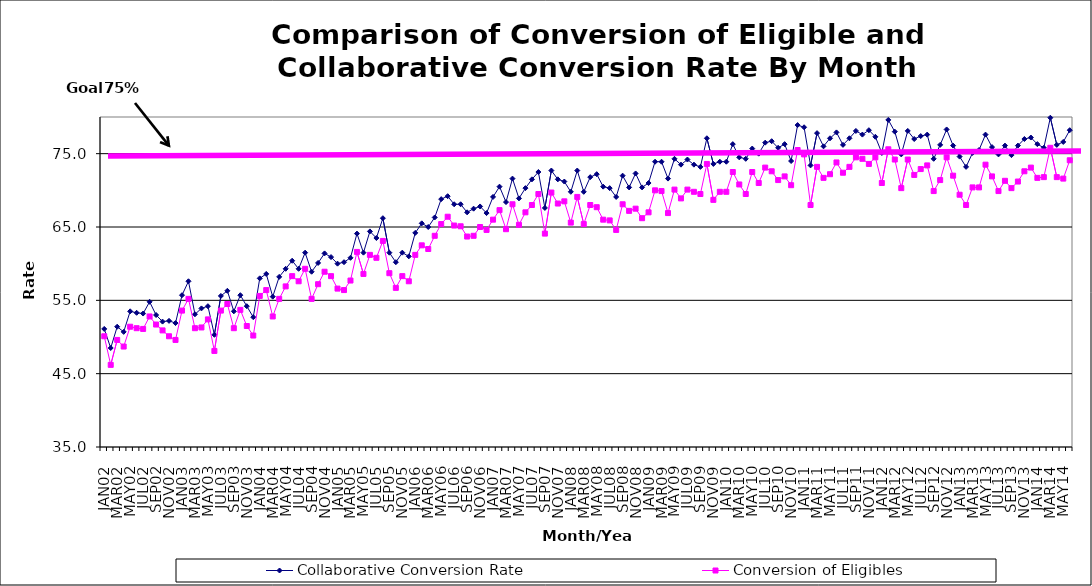
| Category | Collaborative Conversion Rate | Conversion of Eligibles |
|---|---|---|
| JAN02 | 51.1 | 50.1 |
| FEB02 | 48.5 | 46.2 |
| MAR02 | 51.4 | 49.6 |
| APR02 | 50.7 | 48.7 |
| MAY02 | 53.5 | 51.4 |
| JUN02 | 53.3 | 51.2 |
| JUL02 | 53.2 | 51.1 |
| AUG02 | 54.8 | 52.8 |
| SEP02 | 53 | 51.7 |
| OCT02 | 52.1 | 50.9 |
| NOV02 | 52.2 | 50.1 |
| DEC02 | 51.9 | 49.6 |
| JAN03 | 55.7 | 53.6 |
| FEB03 | 57.6 | 55.2 |
| MAR03 | 53.1 | 51.2 |
| APR03 | 53.9 | 51.3 |
| MAY03 | 54.2 | 52.4 |
| JUN03 | 50.3 | 48.1 |
| JUL03 | 55.6 | 53.6 |
| AUG03 | 56.3 | 54.5 |
| SEP03 | 53.5 | 51.2 |
| OCT03 | 55.7 | 53.7 |
| NOV03 | 54.2 | 51.5 |
| DEC03 | 52.7 | 50.2 |
| JAN04 | 58 | 55.6 |
| FEB04 | 58.6 | 56.4 |
| MAR04 | 55.5 | 52.8 |
| APR04 | 58.2 | 55.2 |
| MAY04 | 59.3 | 56.9 |
| JUN04 | 60.4 | 58.3 |
| JUL04 | 59.3 | 57.6 |
| AUG04 | 61.5 | 59.3 |
| SEP04 | 58.9 | 55.2 |
| OCT04 | 60.1 | 57.2 |
| NOV04 | 61.4 | 58.9 |
| DEC04 | 60.9 | 58.3 |
| JAN05 | 60 | 56.6 |
| FEB05 | 60.2 | 56.4 |
| MAR05 | 60.8 | 57.7 |
| APR05 | 64.1 | 61.6 |
| MAY05 | 61.5 | 58.6 |
| JUN05 | 64.4 | 61.2 |
| JUL05 | 63.5 | 60.8 |
| AUG05 | 66.2 | 63.1 |
| SEP05 | 61.5 | 58.7 |
| OCT05 | 60.2 | 56.7 |
| NOV05 | 61.5 | 58.3 |
| DEC05 | 61 | 57.6 |
| JAN06 | 64.2 | 61.2 |
| FEB06 | 65.5 | 62.5 |
| MAR06 | 65 | 62 |
| APR06 | 66.3 | 63.8 |
| MAY06 | 68.8 | 65.4 |
| JUN06 | 69.2 | 66.4 |
| JUL06 | 68.1 | 65.2 |
| AUG06 | 68.1 | 65.1 |
| SEP06 | 67 | 63.7 |
| OCT06 | 67.5 | 63.8 |
| NOV06 | 67.8 | 65 |
| DEC06 | 66.9 | 64.6 |
| JAN07 | 69.1 | 66 |
| FEB07 | 70.5 | 67.3 |
| MAR07 | 68.4 | 64.7 |
| APR07 | 71.6 | 68.1 |
| MAY07 | 68.9 | 65.3 |
| JUN07 | 70.3 | 67 |
| JUL07 | 71.5 | 68 |
| AUG07 | 72.5 | 69.5 |
| SEP07 | 67.6 | 64.1 |
| OCT07 | 72.7 | 69.7 |
| NOV07 | 71.5 | 68.2 |
| DEC07 | 71.2 | 68.5 |
| JAN08 | 69.8 | 65.6 |
| FEB08 | 72.7 | 69.1 |
| MAR08 | 69.8 | 65.4 |
| APR08 | 71.8 | 68 |
| MAY08 | 72.2 | 67.7 |
| JUN08 | 70.5 | 66 |
| JUL08 | 70.3 | 65.9 |
| AUG08 | 69.1 | 64.6 |
| SEP08 | 72 | 68.1 |
| OCT08 | 70.4 | 67.2 |
| NOV08 | 72.3 | 67.5 |
| DEC08 | 70.4 | 66.2 |
| JAN09 | 71 | 67 |
| FEB09 | 73.9 | 70 |
| MAR09 | 73.9 | 69.9 |
| APR09 | 71.6 | 66.9 |
| MAY09 | 74.3 | 70.1 |
| JUN09 | 73.5 | 68.9 |
| JUL09 | 74.2 | 70.1 |
| AUG09 | 73.5 | 69.8 |
| SEP09 | 73.2 | 69.5 |
| OCT09 | 77.1 | 73.6 |
| NOV09 | 73.6 | 68.7 |
| DEC09 | 73.9 | 69.8 |
| JAN10 | 73.9 | 69.8 |
| FEB10 | 76.3 | 72.5 |
| MAR10 | 74.5 | 70.8 |
| APR10 | 74.3 | 69.5 |
| MAY10 | 75.7 | 72.5 |
| JUN10 | 75 | 71 |
| JUL10 | 76.5 | 73.1 |
| AUG10 | 76.7 | 72.6 |
| SEP10 | 75.8 | 71.4 |
| OCT10 | 76.3 | 71.9 |
| NOV10 | 74 | 70.7 |
| DEC10 | 78.9 | 75.5 |
| JAN11 | 78.6 | 74.9 |
| FEB11 | 73.4 | 68 |
| MAR11 | 77.8 | 73.2 |
| APR11 | 76 | 71.7 |
| MAY11 | 77.1 | 72.2 |
| JUN11 | 77.9 | 73.8 |
| JUL11 | 76.2 | 72.4 |
| AUG11 | 77.1 | 73.2 |
| SEP11 | 78.1 | 74.5 |
| OCT11 | 77.6 | 74.3 |
| NOV11 | 78.2 | 73.6 |
| DEC11 | 77.3 | 74.5 |
| JAN12 | 75.1 | 71 |
| FEB12 | 79.6 | 75.6 |
| MAR12 | 78 | 74.2 |
| APR12 | 74.9 | 70.3 |
| MAY12 | 78.1 | 74.2 |
| JUN12 | 77 | 72.1 |
| JUL12 | 77.4 | 72.9 |
| AUG12 | 77.6 | 73.4 |
| SEP12 | 74.3 | 69.9 |
| OCT12 | 76.2 | 71.4 |
| NOV12 | 78.3 | 74.5 |
| DEC12 | 76.1 | 72 |
| JAN13 | 74.6 | 69.4 |
| FEB13 | 73.2 | 68 |
| MAR13 | 75.1 | 70.4 |
| APR13 | 75.5 | 70.4 |
| MAY13 | 77.6 | 73.5 |
| JUN13 | 75.9 | 71.9 |
| JUL13 | 74.9 | 69.9 |
| AUG13 | 76.1 | 71.3 |
| SEP13 | 74.8 | 70.3 |
| OCT13 | 76.1 | 71.2 |
| NOV13 | 77 | 72.6 |
| DEC13 | 77.2 | 73.1 |
| JAN14 | 76.3 | 71.7 |
| FEB14 | 75.8 | 71.8 |
| MAR14 | 79.9 | 75.8 |
| APR14 | 76.2 | 71.8 |
| MAY14 | 76.6 | 71.6 |
| JUN14 | 78.2 | 74.1 |